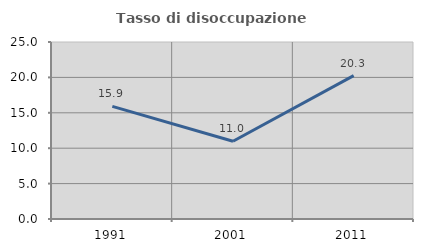
| Category | Tasso di disoccupazione giovanile  |
|---|---|
| 1991.0 | 15.914 |
| 2001.0 | 10.976 |
| 2011.0 | 20.253 |